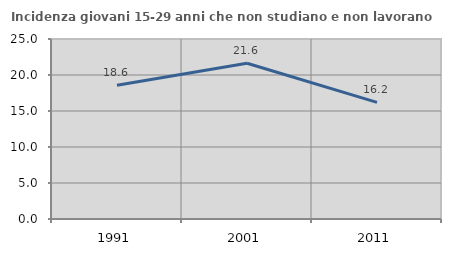
| Category | Incidenza giovani 15-29 anni che non studiano e non lavorano  |
|---|---|
| 1991.0 | 18.573 |
| 2001.0 | 21.635 |
| 2011.0 | 16.201 |